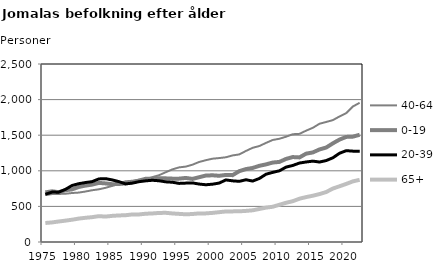
| Category | 40-64 | 0-19 | 20-39 | 65+ |
|---|---|---|---|---|
| 1975.0 | 658 | 697 | 670 | 267 |
| 1976.0 | 673 | 712 | 701 | 275 |
| 1977.0 | 675 | 700 | 700 | 288 |
| 1978.0 | 678 | 727 | 739 | 300 |
| 1979.0 | 688 | 739 | 794 | 313 |
| 1980.0 | 694 | 773 | 819 | 329 |
| 1981.0 | 709 | 792 | 835 | 340 |
| 1982.0 | 727 | 806 | 848 | 349 |
| 1983.0 | 740 | 830 | 886 | 363 |
| 1984.0 | 761 | 823 | 890 | 357 |
| 1985.0 | 788 | 812 | 872 | 367 |
| 1986.0 | 823 | 814 | 848 | 373 |
| 1987.0 | 853 | 824 | 816 | 376 |
| 1988.0 | 860 | 838 | 827 | 387 |
| 1989.0 | 874 | 863 | 847 | 387 |
| 1990.0 | 881 | 888 | 859 | 397 |
| 1991.0 | 911 | 890 | 867 | 401 |
| 1992.0 | 938 | 896 | 860 | 408 |
| 1993.0 | 980 | 894 | 845 | 410 |
| 1994.0 | 1020 | 890 | 839 | 401 |
| 1995.0 | 1048 | 890 | 823 | 395 |
| 1996.0 | 1059 | 900 | 827 | 389 |
| 1997.0 | 1086 | 886 | 830 | 393 |
| 1998.0 | 1124 | 910 | 814 | 402 |
| 1999.0 | 1149 | 933 | 804 | 402 |
| 2000.0 | 1170 | 937 | 812 | 409 |
| 2001.0 | 1179 | 930 | 828 | 419 |
| 2002.0 | 1190 | 942 | 872 | 429 |
| 2003.0 | 1216 | 939 | 859 | 430 |
| 2004.0 | 1230 | 995 | 852 | 431 |
| 2005.0 | 1279 | 1024 | 874 | 437 |
| 2006.0 | 1323 | 1040 | 856 | 445 |
| 2007.0 | 1348 | 1070 | 892 | 464 |
| 2008.0 | 1392 | 1090 | 952 | 483 |
| 2009.0 | 1433 | 1116 | 978 | 495 |
| 2010.0 | 1450 | 1125 | 1000 | 523 |
| 2011.0 | 1479 | 1167 | 1052 | 551 |
| 2012.0 | 1514 | 1193 | 1075 | 573 |
| 2013.0 | 1519 | 1188 | 1109 | 608 |
| 2014.0 | 1564 | 1241 | 1124 | 631 |
| 2015.0 | 1604 | 1258 | 1136 | 650 |
| 2016.0 | 1661 | 1300 | 1123 | 673 |
| 2017.0 | 1686 | 1327 | 1144 | 702 |
| 2018.0 | 1712 | 1386 | 1183 | 751 |
| 2019.0 | 1764 | 1439 | 1247 | 783 |
| 2020.0 | 1811 | 1476 | 1283 | 816 |
| 2021.0 | 1904 | 1480 | 1276 | 852 |
| 2022.0 | 1955 | 1506 | 1276 | 873 |